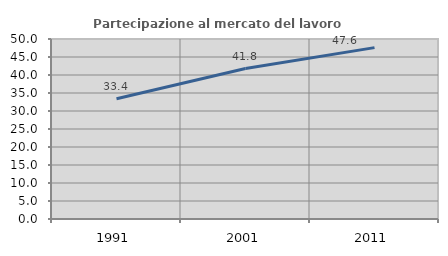
| Category | Partecipazione al mercato del lavoro  femminile |
|---|---|
| 1991.0 | 33.407 |
| 2001.0 | 41.791 |
| 2011.0 | 47.604 |